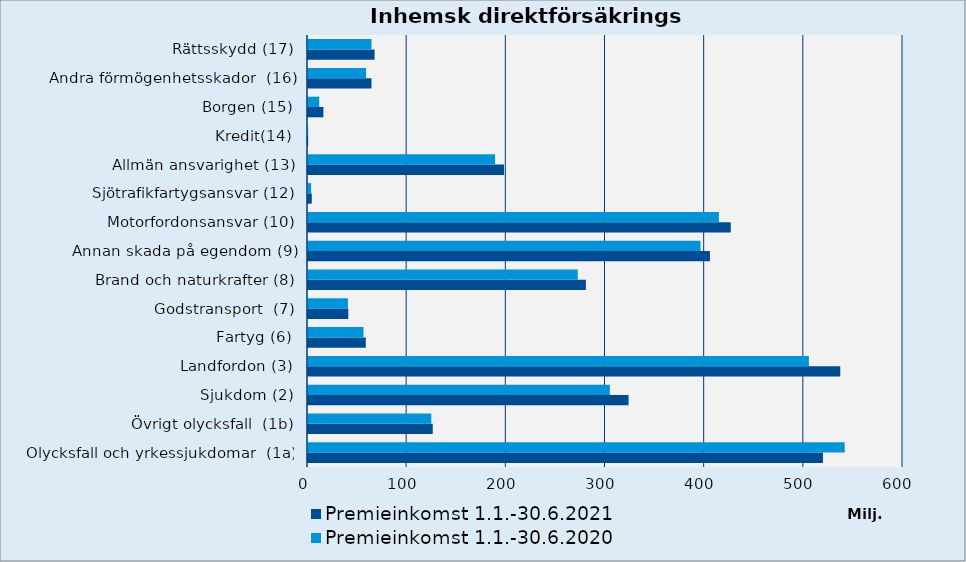
| Category | Premieinkomst |
|---|---|
| Olycksfall och yrkessjukdomar  (1a) | 541248.679 |
| Övrigt olycksfall  (1b) | 124304.525 |
| Sjukdom (2) | 304411.718 |
| Landfordon (3) | 505089.273 |
| Fartyg (6) | 55968.274 |
| Godstransport  (7) | 40217.75 |
| Brand och naturkrafter (8) | 272045.371 |
| Annan skada på egendom (9) | 395813.817 |
| Motorfordonsansvar (10) | 414358.803 |
| Sjötrafikfartygsansvar (12) | 3126.74 |
| Allmän ansvarighet (13) | 188654.525 |
| Kredit(14) | 130.491 |
| Borgen (15) | 11280.655 |
| Andra förmögenhetsskador  (16) | 58524.778 |
| Rättsskydd (17) | 64048.359 |